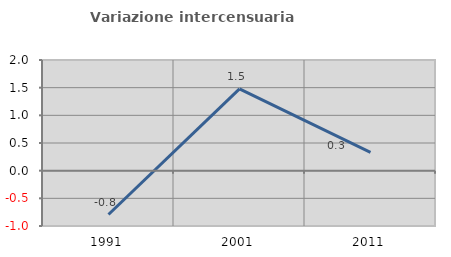
| Category | Variazione intercensuaria annua |
|---|---|
| 1991.0 | -0.793 |
| 2001.0 | 1.477 |
| 2011.0 | 0.33 |